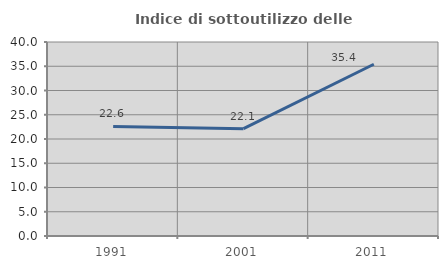
| Category | Indice di sottoutilizzo delle abitazioni  |
|---|---|
| 1991.0 | 22.6 |
| 2001.0 | 22.123 |
| 2011.0 | 35.41 |